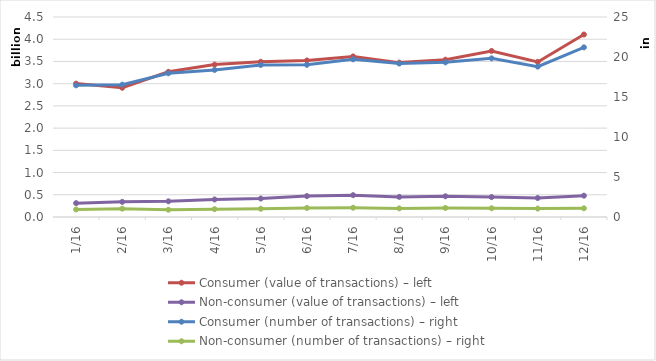
| Category | Consumer (value of transactions) – left | Non-consumer (value of transactions) – left |
|---|---|---|
| 2016-01-01 | 3001354360 | 312001821 |
| 2016-02-01 | 2907569232 | 340699982 |
| 2016-03-01 | 3267543588 | 352135650 |
| 2016-04-01 | 3429513685 | 394486133 |
| 2016-05-01 | 3492207443 | 415293100 |
| 2016-06-01 | 3522099061 | 470704671 |
| 2016-07-01 | 3612953793 | 491489599 |
| 2016-08-01 | 3473569802 | 452390186 |
| 2016-09-01 | 3539416437 | 465878956 |
| 2016-10-01 | 3736097787 | 448212508 |
| 2016-11-01 | 3489339727 | 427283247 |
| 2016-12-01 | 4106103503 | 479573196 |